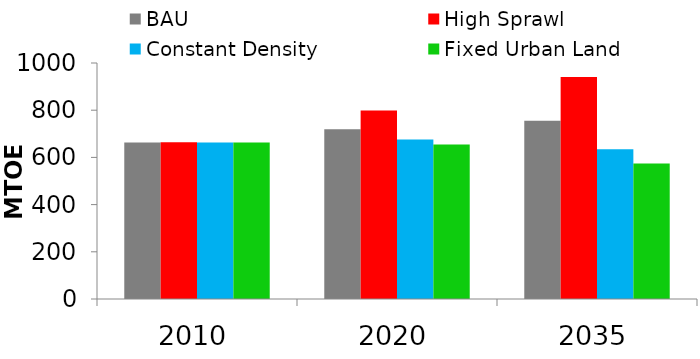
| Category | BAU | High Sprawl | Constant Density | Fixed Urban Land |
|---|---|---|---|---|
| 2010.0 | 663.507 | 663.691 | 662.97 | 662.913 |
| 2020.0 | 719.308 | 798.389 | 675.393 | 655.081 |
| 2035.0 | 755.755 | 940.809 | 634.622 | 574.559 |